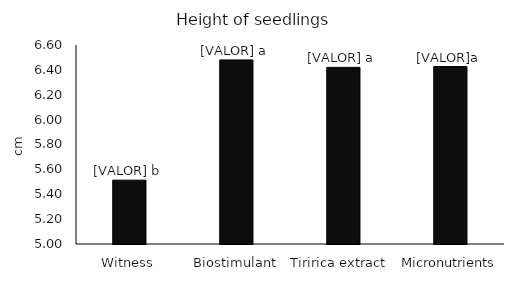
| Category | Series 0 |
|---|---|
| Witness | 5.513 |
| Biostimulant | 6.48 |
| Tiririca extract  | 6.42 |
| Micronutrients | 6.427 |